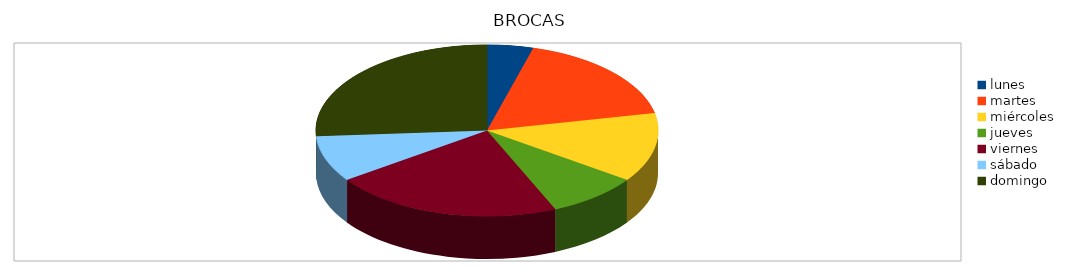
| Category | Series 0 |
|---|---|
| lunes | 656 |
| martes | 2624 |
| miércoles | 1968 |
| jueves | 1312 |
| viernes | 3280 |
| sábado | 1312 |
| domingo | 3936 |